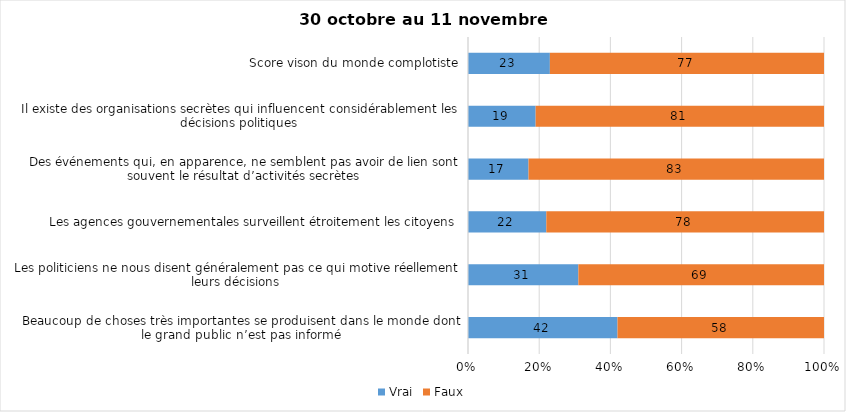
| Category | Vrai | Faux |
|---|---|---|
| Beaucoup de choses très importantes se produisent dans le monde dont le grand public n’est pas informé | 42 | 58 |
| Les politiciens ne nous disent généralement pas ce qui motive réellement leurs décisions | 31 | 69 |
| Les agences gouvernementales surveillent étroitement les citoyens | 22 | 78 |
| Des événements qui, en apparence, ne semblent pas avoir de lien sont souvent le résultat d’activités secrètes | 17 | 83 |
| Il existe des organisations secrètes qui influencent considérablement les décisions politiques | 19 | 81 |
| Score vison du monde complotiste | 23 | 77 |